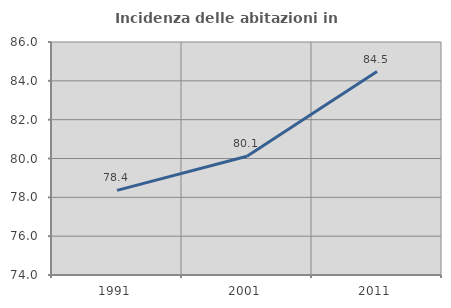
| Category | Incidenza delle abitazioni in proprietà  |
|---|---|
| 1991.0 | 78.36 |
| 2001.0 | 80.119 |
| 2011.0 | 84.478 |